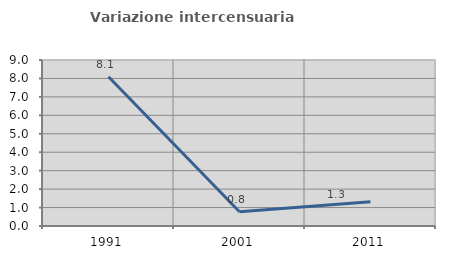
| Category | Variazione intercensuaria annua |
|---|---|
| 1991.0 | 8.089 |
| 2001.0 | 0.77 |
| 2011.0 | 1.317 |